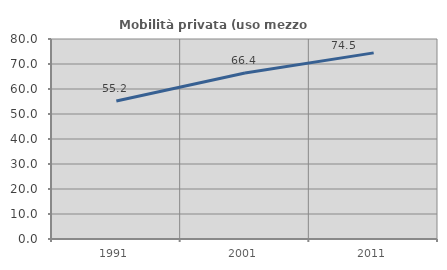
| Category | Mobilità privata (uso mezzo privato) |
|---|---|
| 1991.0 | 55.223 |
| 2001.0 | 66.415 |
| 2011.0 | 74.456 |